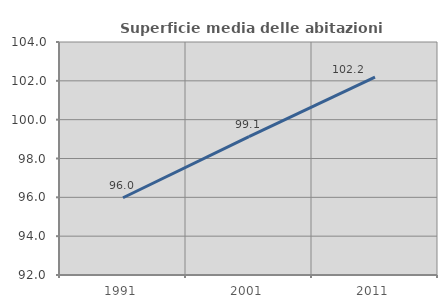
| Category | Superficie media delle abitazioni occupate |
|---|---|
| 1991.0 | 95.98 |
| 2001.0 | 99.131 |
| 2011.0 | 102.189 |